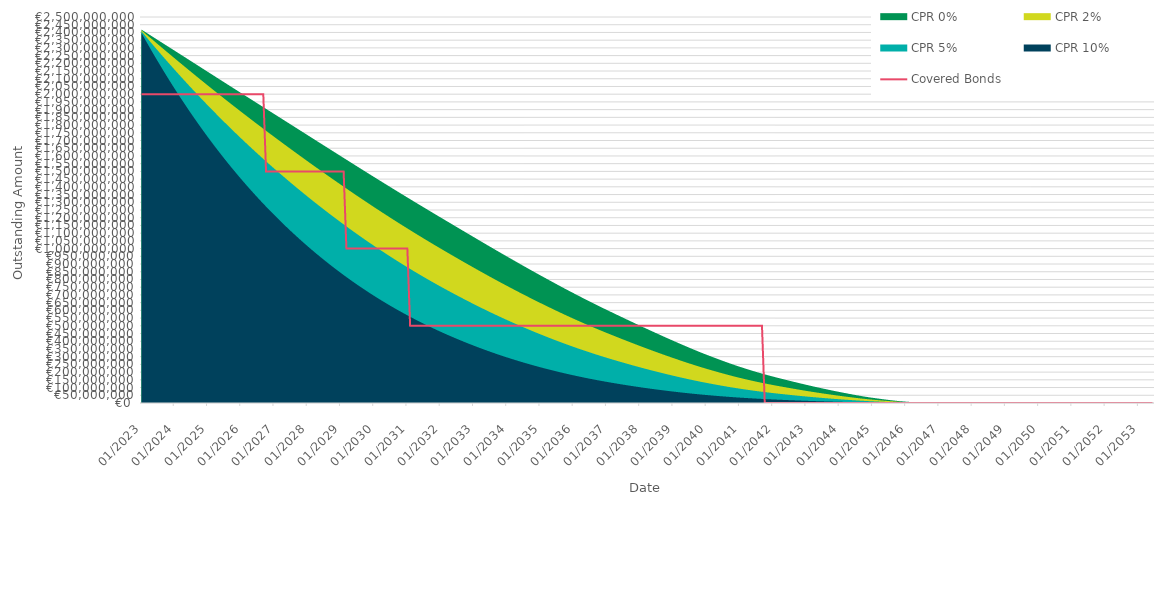
| Category | Covered Bonds |
|---|---|
| 2023-01-31 | 2000000000 |
| 2023-02-28 | 2000000000 |
| 2023-03-31 | 2000000000 |
| 2023-04-30 | 2000000000 |
| 2023-05-31 | 2000000000 |
| 2023-06-30 | 2000000000 |
| 2023-07-31 | 2000000000 |
| 2023-08-31 | 2000000000 |
| 2023-09-30 | 2000000000 |
| 2023-10-31 | 2000000000 |
| 2023-11-30 | 2000000000 |
| 2023-12-31 | 2000000000 |
| 2024-01-31 | 2000000000 |
| 2024-02-29 | 2000000000 |
| 2024-03-31 | 2000000000 |
| 2024-04-30 | 2000000000 |
| 2024-05-31 | 2000000000 |
| 2024-06-30 | 2000000000 |
| 2024-07-31 | 2000000000 |
| 2024-08-31 | 2000000000 |
| 2024-09-30 | 2000000000 |
| 2024-10-31 | 2000000000 |
| 2024-11-30 | 2000000000 |
| 2024-12-31 | 2000000000 |
| 2025-01-31 | 2000000000 |
| 2025-02-28 | 2000000000 |
| 2025-03-31 | 2000000000 |
| 2025-04-30 | 2000000000 |
| 2025-05-31 | 2000000000 |
| 2025-06-30 | 2000000000 |
| 2025-07-31 | 2000000000 |
| 2025-08-31 | 2000000000 |
| 2025-09-30 | 2000000000 |
| 2025-10-31 | 2000000000 |
| 2025-11-30 | 2000000000 |
| 2025-12-31 | 2000000000 |
| 2026-01-31 | 2000000000 |
| 2026-02-28 | 2000000000 |
| 2026-03-31 | 2000000000 |
| 2026-04-30 | 2000000000 |
| 2026-05-31 | 2000000000 |
| 2026-06-30 | 2000000000 |
| 2026-07-31 | 2000000000 |
| 2026-08-31 | 2000000000 |
| 2026-09-30 | 2000000000 |
| 2026-10-31 | 1500000000 |
| 2026-11-30 | 1500000000 |
| 2026-12-31 | 1500000000 |
| 2027-01-31 | 1500000000 |
| 2027-02-28 | 1500000000 |
| 2027-03-31 | 1500000000 |
| 2027-04-30 | 1500000000 |
| 2027-05-31 | 1500000000 |
| 2027-06-30 | 1500000000 |
| 2027-07-31 | 1500000000 |
| 2027-08-31 | 1500000000 |
| 2027-09-30 | 1500000000 |
| 2027-10-31 | 1500000000 |
| 2027-11-30 | 1500000000 |
| 2027-12-31 | 1500000000 |
| 2028-01-31 | 1500000000 |
| 2028-02-29 | 1500000000 |
| 2028-03-31 | 1500000000 |
| 2028-04-30 | 1500000000 |
| 2028-05-31 | 1500000000 |
| 2028-06-30 | 1500000000 |
| 2028-07-31 | 1500000000 |
| 2028-08-31 | 1500000000 |
| 2028-09-30 | 1500000000 |
| 2028-10-31 | 1500000000 |
| 2028-11-30 | 1500000000 |
| 2028-12-31 | 1500000000 |
| 2029-01-31 | 1500000000 |
| 2029-02-28 | 1500000000 |
| 2029-03-31 | 1000000000 |
| 2029-04-30 | 1000000000 |
| 2029-05-31 | 1000000000 |
| 2029-06-30 | 1000000000 |
| 2029-07-31 | 1000000000 |
| 2029-08-31 | 1000000000 |
| 2029-09-30 | 1000000000 |
| 2029-10-31 | 1000000000 |
| 2029-11-30 | 1000000000 |
| 2029-12-31 | 1000000000 |
| 2030-01-31 | 1000000000 |
| 2030-02-28 | 1000000000 |
| 2030-03-31 | 1000000000 |
| 2030-04-30 | 1000000000 |
| 2030-05-31 | 1000000000 |
| 2030-06-30 | 1000000000 |
| 2030-07-31 | 1000000000 |
| 2030-08-31 | 1000000000 |
| 2030-09-30 | 1000000000 |
| 2030-10-31 | 1000000000 |
| 2030-11-30 | 1000000000 |
| 2030-12-31 | 1000000000 |
| 2031-01-31 | 1000000000 |
| 2031-02-28 | 500000000 |
| 2031-03-31 | 500000000 |
| 2031-04-30 | 500000000 |
| 2031-05-31 | 500000000 |
| 2031-06-30 | 500000000 |
| 2031-07-31 | 500000000 |
| 2031-08-31 | 500000000 |
| 2031-09-30 | 500000000 |
| 2031-10-31 | 500000000 |
| 2031-11-30 | 500000000 |
| 2031-12-31 | 500000000 |
| 2032-01-31 | 500000000 |
| 2032-02-29 | 500000000 |
| 2032-03-31 | 500000000 |
| 2032-04-30 | 500000000 |
| 2032-05-31 | 500000000 |
| 2032-06-30 | 500000000 |
| 2032-07-31 | 500000000 |
| 2032-08-31 | 500000000 |
| 2032-09-30 | 500000000 |
| 2032-10-31 | 500000000 |
| 2032-11-30 | 500000000 |
| 2032-12-31 | 500000000 |
| 2033-01-31 | 500000000 |
| 2033-02-28 | 500000000 |
| 2033-03-31 | 500000000 |
| 2033-04-30 | 500000000 |
| 2033-05-31 | 500000000 |
| 2033-06-30 | 500000000 |
| 2033-07-31 | 500000000 |
| 2033-08-31 | 500000000 |
| 2033-09-30 | 500000000 |
| 2033-10-31 | 500000000 |
| 2033-11-30 | 500000000 |
| 2033-12-31 | 500000000 |
| 2034-01-31 | 500000000 |
| 2034-02-28 | 500000000 |
| 2034-03-31 | 500000000 |
| 2034-04-30 | 500000000 |
| 2034-05-31 | 500000000 |
| 2034-06-30 | 500000000 |
| 2034-07-31 | 500000000 |
| 2034-08-31 | 500000000 |
| 2034-09-30 | 500000000 |
| 2034-10-31 | 500000000 |
| 2034-11-30 | 500000000 |
| 2034-12-31 | 500000000 |
| 2035-01-31 | 500000000 |
| 2035-02-28 | 500000000 |
| 2035-03-31 | 500000000 |
| 2035-04-30 | 500000000 |
| 2035-05-31 | 500000000 |
| 2035-06-30 | 500000000 |
| 2035-07-31 | 500000000 |
| 2035-08-31 | 500000000 |
| 2035-09-30 | 500000000 |
| 2035-10-31 | 500000000 |
| 2035-11-30 | 500000000 |
| 2035-12-31 | 500000000 |
| 2036-01-31 | 500000000 |
| 2036-02-29 | 500000000 |
| 2036-03-31 | 500000000 |
| 2036-04-30 | 500000000 |
| 2036-05-31 | 500000000 |
| 2036-06-30 | 500000000 |
| 2036-07-31 | 500000000 |
| 2036-08-31 | 500000000 |
| 2036-09-30 | 500000000 |
| 2036-10-31 | 500000000 |
| 2036-11-30 | 500000000 |
| 2036-12-31 | 500000000 |
| 2037-01-31 | 500000000 |
| 2037-02-28 | 500000000 |
| 2037-03-31 | 500000000 |
| 2037-04-30 | 500000000 |
| 2037-05-31 | 500000000 |
| 2037-06-30 | 500000000 |
| 2037-07-31 | 500000000 |
| 2037-08-31 | 500000000 |
| 2037-09-30 | 500000000 |
| 2037-10-31 | 500000000 |
| 2037-11-30 | 500000000 |
| 2037-12-31 | 500000000 |
| 2038-01-31 | 500000000 |
| 2038-02-28 | 500000000 |
| 2038-03-31 | 500000000 |
| 2038-04-30 | 500000000 |
| 2038-05-31 | 500000000 |
| 2038-06-30 | 500000000 |
| 2038-07-31 | 500000000 |
| 2038-08-31 | 500000000 |
| 2038-09-30 | 500000000 |
| 2038-10-31 | 500000000 |
| 2038-11-30 | 500000000 |
| 2038-12-31 | 500000000 |
| 2039-01-31 | 500000000 |
| 2039-02-28 | 500000000 |
| 2039-03-31 | 500000000 |
| 2039-04-30 | 500000000 |
| 2039-05-31 | 500000000 |
| 2039-06-30 | 500000000 |
| 2039-07-31 | 500000000 |
| 2039-08-31 | 500000000 |
| 2039-09-30 | 500000000 |
| 2039-10-31 | 500000000 |
| 2039-11-30 | 500000000 |
| 2039-12-31 | 500000000 |
| 2040-01-31 | 500000000 |
| 2040-02-29 | 500000000 |
| 2040-03-31 | 500000000 |
| 2040-04-30 | 500000000 |
| 2040-05-31 | 500000000 |
| 2040-06-30 | 500000000 |
| 2040-07-31 | 500000000 |
| 2040-08-31 | 500000000 |
| 2040-09-30 | 500000000 |
| 2040-10-31 | 500000000 |
| 2040-11-30 | 500000000 |
| 2040-12-31 | 500000000 |
| 2041-01-31 | 500000000 |
| 2041-02-28 | 500000000 |
| 2041-03-31 | 500000000 |
| 2041-04-30 | 500000000 |
| 2041-05-31 | 500000000 |
| 2041-06-30 | 500000000 |
| 2041-07-31 | 500000000 |
| 2041-08-31 | 500000000 |
| 2041-09-30 | 500000000 |
| 2041-10-31 | 0 |
| 2041-11-30 | 0 |
| 2041-12-31 | 0 |
| 2042-01-31 | 0 |
| 2042-02-28 | 0 |
| 2042-03-31 | 0 |
| 2042-04-30 | 0 |
| 2042-05-31 | 0 |
| 2042-06-30 | 0 |
| 2042-07-31 | 0 |
| 2042-08-31 | 0 |
| 2042-09-30 | 0 |
| 2042-10-31 | 0 |
| 2042-11-30 | 0 |
| 2042-12-31 | 0 |
| 2043-01-31 | 0 |
| 2043-02-28 | 0 |
| 2043-03-31 | 0 |
| 2043-04-30 | 0 |
| 2043-05-31 | 0 |
| 2043-06-30 | 0 |
| 2043-07-31 | 0 |
| 2043-08-31 | 0 |
| 2043-09-30 | 0 |
| 2043-10-31 | 0 |
| 2043-11-30 | 0 |
| 2043-12-31 | 0 |
| 2044-01-31 | 0 |
| 2044-02-29 | 0 |
| 2044-03-31 | 0 |
| 2044-04-30 | 0 |
| 2044-05-31 | 0 |
| 2044-06-30 | 0 |
| 2044-07-31 | 0 |
| 2044-08-31 | 0 |
| 2044-09-30 | 0 |
| 2044-10-31 | 0 |
| 2044-11-30 | 0 |
| 2044-12-31 | 0 |
| 2045-01-31 | 0 |
| 2045-02-28 | 0 |
| 2045-03-31 | 0 |
| 2045-04-30 | 0 |
| 2045-05-31 | 0 |
| 2045-06-30 | 0 |
| 2045-07-31 | 0 |
| 2045-08-31 | 0 |
| 2045-09-30 | 0 |
| 2045-10-31 | 0 |
| 2045-11-30 | 0 |
| 2045-12-31 | 0 |
| 2046-01-31 | 0 |
| 2046-02-28 | 0 |
| 2046-03-31 | 0 |
| 2046-04-30 | 0 |
| 2046-05-31 | 0 |
| 2046-06-30 | 0 |
| 2046-07-31 | 0 |
| 2046-08-31 | 0 |
| 2046-09-30 | 0 |
| 2046-10-31 | 0 |
| 2046-11-30 | 0 |
| 2046-12-31 | 0 |
| 2047-01-31 | 0 |
| 2047-02-28 | 0 |
| 2047-03-31 | 0 |
| 2047-04-30 | 0 |
| 2047-05-31 | 0 |
| 2047-06-30 | 0 |
| 2047-07-31 | 0 |
| 2047-08-31 | 0 |
| 2047-09-30 | 0 |
| 2047-10-31 | 0 |
| 2047-11-30 | 0 |
| 2047-12-31 | 0 |
| 2048-01-31 | 0 |
| 2048-02-29 | 0 |
| 2048-03-31 | 0 |
| 2048-04-30 | 0 |
| 2048-05-31 | 0 |
| 2048-06-30 | 0 |
| 2048-07-31 | 0 |
| 2048-08-31 | 0 |
| 2048-09-30 | 0 |
| 2048-10-31 | 0 |
| 2048-11-30 | 0 |
| 2048-12-31 | 0 |
| 2049-01-31 | 0 |
| 2049-02-28 | 0 |
| 2049-03-31 | 0 |
| 2049-04-30 | 0 |
| 2049-05-31 | 0 |
| 2049-06-30 | 0 |
| 2049-07-31 | 0 |
| 2049-08-31 | 0 |
| 2049-09-30 | 0 |
| 2049-10-31 | 0 |
| 2049-11-30 | 0 |
| 2049-12-31 | 0 |
| 2050-01-31 | 0 |
| 2050-02-28 | 0 |
| 2050-03-31 | 0 |
| 2050-04-30 | 0 |
| 2050-05-31 | 0 |
| 2050-06-30 | 0 |
| 2050-07-31 | 0 |
| 2050-08-31 | 0 |
| 2050-09-30 | 0 |
| 2050-10-31 | 0 |
| 2050-11-30 | 0 |
| 2050-12-31 | 0 |
| 2051-01-31 | 0 |
| 2051-02-28 | 0 |
| 2051-03-31 | 0 |
| 2051-04-30 | 0 |
| 2051-05-31 | 0 |
| 2051-06-30 | 0 |
| 2051-07-31 | 0 |
| 2051-08-31 | 0 |
| 2051-09-30 | 0 |
| 2051-10-31 | 0 |
| 2051-11-30 | 0 |
| 2051-12-31 | 0 |
| 2052-01-31 | 0 |
| 2052-02-29 | 0 |
| 2052-03-31 | 0 |
| 2052-04-30 | 0 |
| 2052-05-31 | 0 |
| 2052-06-30 | 0 |
| 2052-07-31 | 0 |
| 2052-08-31 | 0 |
| 2052-09-30 | 0 |
| 2052-10-31 | 0 |
| 2052-11-30 | 0 |
| 2052-12-31 | 0 |
| 2053-01-31 | 0 |
| 2053-02-28 | 0 |
| 2053-03-31 | 0 |
| 2053-04-30 | 0 |
| 2053-05-31 | 0 |
| 2053-06-30 | 0 |